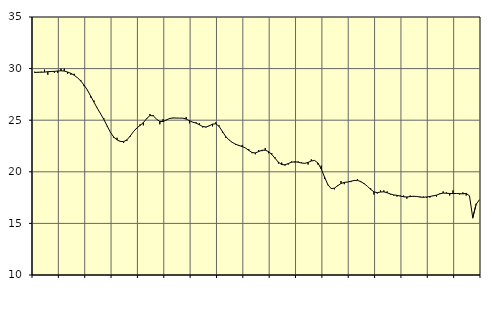
| Category | Piggar | Tillverkning o utvinning, energi o miljö, SNI 05-33, 35-39 |
|---|---|---|
| nan | 29.7 | 29.62 |
| 87.0 | 29.6 | 29.65 |
| 87.0 | 29.7 | 29.65 |
| 87.0 | 29.9 | 29.66 |
| nan | 29.4 | 29.7 |
| 88.0 | 29.7 | 29.72 |
| 88.0 | 29.6 | 29.73 |
| 88.0 | 29.6 | 29.77 |
| nan | 30 | 29.79 |
| 89.0 | 30 | 29.76 |
| 89.0 | 29.5 | 29.67 |
| 89.0 | 29.4 | 29.54 |
| nan | 29.5 | 29.36 |
| 90.0 | 29.1 | 29.11 |
| 90.0 | 28.9 | 28.8 |
| 90.0 | 28.3 | 28.41 |
| nan | 27.9 | 27.93 |
| 91.0 | 27.2 | 27.35 |
| 91.0 | 26.9 | 26.75 |
| 91.0 | 26.2 | 26.17 |
| nan | 25.7 | 25.63 |
| 92.0 | 25.2 | 25.08 |
| 92.0 | 24.4 | 24.45 |
| 92.0 | 23.8 | 23.83 |
| nan | 23.3 | 23.37 |
| 93.0 | 23.3 | 23.09 |
| 93.0 | 22.9 | 22.95 |
| 93.0 | 22.8 | 22.92 |
| nan | 23 | 23.09 |
| 94.0 | 23.4 | 23.46 |
| 94.0 | 23.9 | 23.89 |
| 94.0 | 24.2 | 24.24 |
| nan | 24.6 | 24.49 |
| 95.0 | 24.5 | 24.77 |
| 95.0 | 25.2 | 25.15 |
| 95.0 | 25.6 | 25.45 |
| nan | 25.5 | 25.42 |
| 96.0 | 25.1 | 25.11 |
| 96.0 | 24.6 | 24.87 |
| 96.0 | 25.1 | 24.87 |
| nan | 25 | 25.03 |
| 97.0 | 25.2 | 25.17 |
| 97.0 | 25.2 | 25.22 |
| 97.0 | 25.2 | 25.21 |
| nan | 25.2 | 25.2 |
| 98.0 | 25.2 | 25.2 |
| 98.0 | 25.3 | 25.11 |
| 98.0 | 24.7 | 24.95 |
| nan | 24.8 | 24.81 |
| 99.0 | 24.8 | 24.72 |
| 99.0 | 24.7 | 24.56 |
| 99.0 | 24.3 | 24.39 |
| nan | 24.3 | 24.34 |
| 0.0 | 24.5 | 24.45 |
| 0.0 | 24.4 | 24.62 |
| 0.0 | 24.8 | 24.65 |
| nan | 24.5 | 24.4 |
| 1.0 | 23.8 | 23.91 |
| 1.0 | 23.3 | 23.42 |
| 1.0 | 23.1 | 23.09 |
| nan | 22.8 | 22.85 |
| 2.0 | 22.6 | 22.67 |
| 2.0 | 22.6 | 22.55 |
| 2.0 | 22.6 | 22.45 |
| nan | 22.3 | 22.31 |
| 3.0 | 22.2 | 22.08 |
| 3.0 | 21.8 | 21.87 |
| 3.0 | 21.7 | 21.83 |
| nan | 22.1 | 21.96 |
| 4.0 | 22 | 22.09 |
| 4.0 | 22.3 | 22.09 |
| 4.0 | 21.8 | 21.96 |
| nan | 21.8 | 21.68 |
| 5.0 | 21.4 | 21.3 |
| 5.0 | 20.8 | 20.93 |
| 5.0 | 20.9 | 20.7 |
| nan | 20.6 | 20.68 |
| 6.0 | 20.7 | 20.8 |
| 6.0 | 21 | 20.93 |
| 6.0 | 20.9 | 20.97 |
| nan | 21 | 20.93 |
| 7.0 | 20.9 | 20.85 |
| 7.0 | 20.8 | 20.82 |
| 7.0 | 20.7 | 20.91 |
| nan | 21.2 | 21.05 |
| 8.0 | 21.1 | 21.1 |
| 8.0 | 20.7 | 20.85 |
| 8.0 | 20.6 | 20.27 |
| nan | 19.3 | 19.5 |
| 9.0 | 18.7 | 18.76 |
| 9.0 | 18.4 | 18.38 |
| 9.0 | 18.3 | 18.41 |
| nan | 18.7 | 18.65 |
| 10.0 | 19.1 | 18.87 |
| 10.0 | 18.8 | 18.97 |
| 10.0 | 19 | 19.01 |
| nan | 19 | 19.08 |
| 11.0 | 19.2 | 19.16 |
| 11.0 | 19.3 | 19.17 |
| 11.0 | 19 | 19.05 |
| nan | 18.9 | 18.85 |
| 12.0 | 18.6 | 18.6 |
| 12.0 | 18.4 | 18.3 |
| 12.0 | 17.8 | 18.06 |
| nan | 17.9 | 17.98 |
| 13.0 | 18.2 | 18.04 |
| 13.0 | 18.2 | 18.06 |
| 13.0 | 18.1 | 17.97 |
| nan | 17.8 | 17.85 |
| 14.0 | 17.7 | 17.76 |
| 14.0 | 17.6 | 17.72 |
| 14.0 | 17.7 | 17.65 |
| nan | 17.7 | 17.58 |
| 15.0 | 17.4 | 17.56 |
| 15.0 | 17.7 | 17.6 |
| 15.0 | 17.6 | 17.63 |
| nan | 17.6 | 17.61 |
| 16.0 | 17.6 | 17.55 |
| 16.0 | 17.6 | 17.53 |
| 16.0 | 17.5 | 17.56 |
| nan | 17.5 | 17.61 |
| 17.0 | 17.7 | 17.67 |
| 17.0 | 17.6 | 17.74 |
| 17.0 | 17.9 | 17.86 |
| nan | 18.1 | 17.94 |
| 18.0 | 18 | 17.92 |
| 18.0 | 17.7 | 17.9 |
| 18.0 | 18.2 | 17.89 |
| nan | 17.9 | 17.9 |
| 19.0 | 17.8 | 17.88 |
| 19.0 | 18 | 17.86 |
| 19.0 | 17.7 | 17.91 |
| nan | 17.6 | 17.67 |
| 20.0 | 15.5 | 15.55 |
| 20.0 | 16.9 | 16.83 |
| 20.0 | 17.3 | 17.29 |